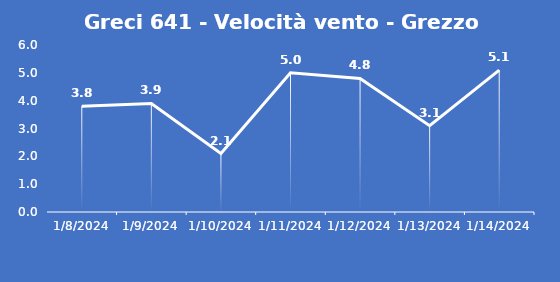
| Category | Greci 641 - Velocità vento - Grezzo (m/s) |
|---|---|
| 1/8/24 | 3.8 |
| 1/9/24 | 3.9 |
| 1/10/24 | 2.1 |
| 1/11/24 | 5 |
| 1/12/24 | 4.8 |
| 1/13/24 | 3.1 |
| 1/14/24 | 5.1 |